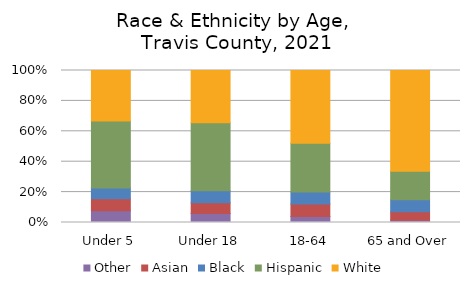
| Category | Other | Asian | Black | Hispanic | White |
|---|---|---|---|---|---|
| Under 5 | 0.077 | 0.078 | 0.071 | 0.441 | 0.333 |
| Under 18 | 0.06 | 0.07 | 0.079 | 0.447 | 0.344 |
| 18-64 | 0.039 | 0.082 | 0.079 | 0.322 | 0.478 |
| 65 and Over | 0.014 | 0.056 | 0.079 | 0.188 | 0.663 |